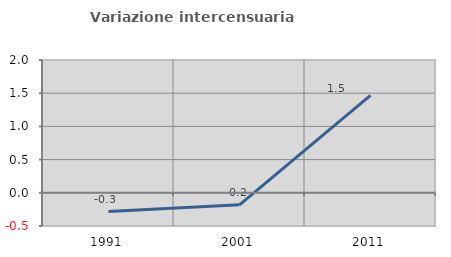
| Category | Variazione intercensuaria annua |
|---|---|
| 1991.0 | -0.282 |
| 2001.0 | -0.181 |
| 2011.0 | 1.468 |